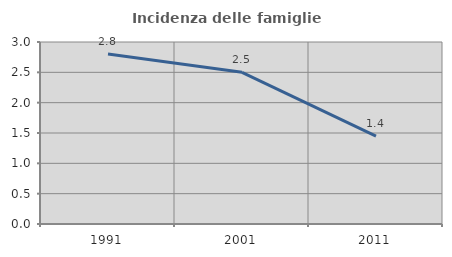
| Category | Incidenza delle famiglie numerose |
|---|---|
| 1991.0 | 2.804 |
| 2001.0 | 2.5 |
| 2011.0 | 1.449 |